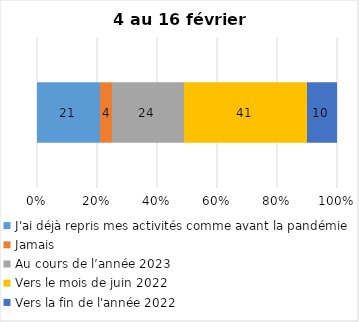
| Category | J'ai déjà repris mes activités comme avant la pandémie | Jamais | Au cours de l’année 2023 | Vers le mois de juin 2022 | Vers la fin de l'année 2022 |
|---|---|---|---|---|---|
| 0 | 21 | 4 | 24 | 41 | 10 |